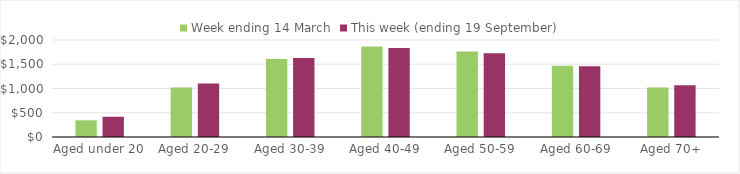
| Category | Week ending 14 March | This week (ending 19 September) |
|---|---|---|
| Aged under 20 | 344.75 | 417.79 |
| Aged 20-29 | 1022.64 | 1102 |
| Aged 30-39 | 1605.9 | 1629.43 |
| Aged 40-49 | 1864.46 | 1837.18 |
| Aged 50-59 | 1763.09 | 1728.56 |
| Aged 60-69 | 1470.64 | 1458.69 |
| Aged 70+ | 1021.43 | 1067.32 |